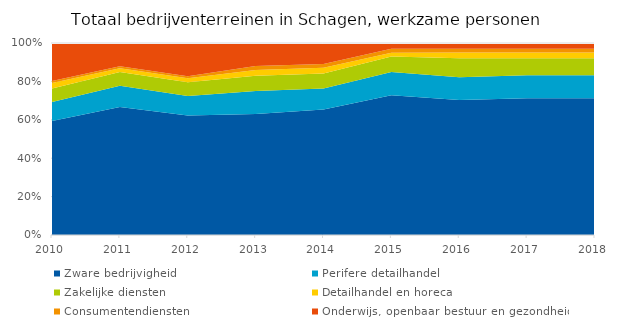
| Category | Zware bedrijvigheid | Perifere detailhandel | Zakelijke diensten | Detailhandel en horeca | Consumentendiensten | Onderwijs, openbaar bestuur en gezondheid |
|---|---|---|---|---|---|---|
| 2010 | 0.6 | 0.1 | 0.07 | 0.03 | 0.01 | 0.2 |
| 2011 | 0.66 | 0.11 | 0.07 | 0.02 | 0.01 | 0.12 |
| 2012 | 0.61 | 0.1 | 0.07 | 0.02 | 0.01 | 0.17 |
| 2013 | 0.63 | 0.12 | 0.08 | 0.03 | 0.02 | 0.12 |
| 2014 | 0.66 | 0.11 | 0.08 | 0.03 | 0.02 | 0.11 |
| 2015 | 0.72 | 0.12 | 0.08 | 0.02 | 0.02 | 0.03 |
| 2016 | 0.71 | 0.12 | 0.1 | 0.03 | 0.02 | 0.03 |
| 2017 | 0.72 | 0.12 | 0.09 | 0.03 | 0.02 | 0.03 |
| 2018 | 0.72 | 0.12 | 0.09 | 0.03 | 0.02 | 0.03 |